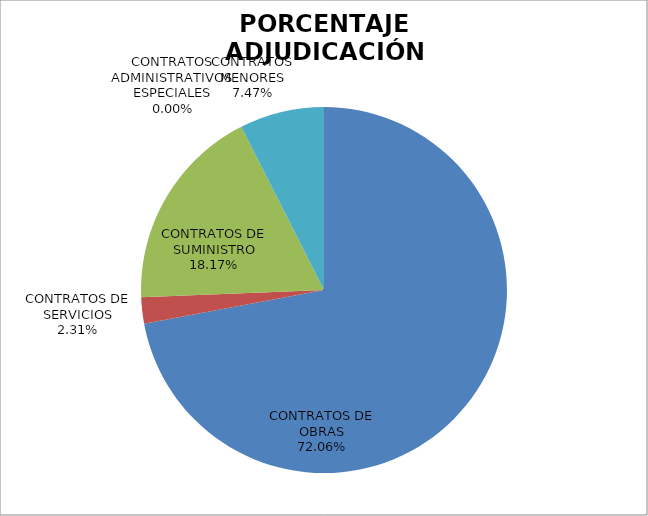
| Category | PORCENTAJE ADJUDICACIÓN CONTRATOS 2017 |
|---|---|
| CONTRATOS DE OBRAS | 72.057 |
| CONTRATOS DE SERVICIOS | 2.306 |
| CONTRATOS DE SUMINISTRO | 18.17 |
| CONTRATOS ADMINISTRATIVOS ESPECIALES | 0 |
| CONTRATOS MENORES | 7.466 |